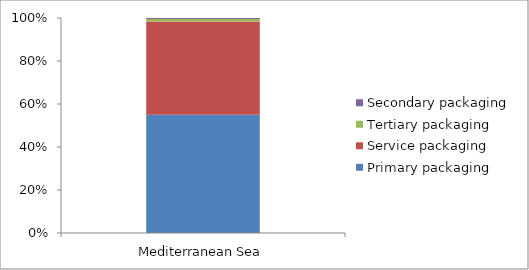
| Category | Primary packaging | Service packaging | Tertiary packaging | Secondary packaging |
|---|---|---|---|---|
| Mediterranean Sea | 9547 | 7551 | 200 | 73 |